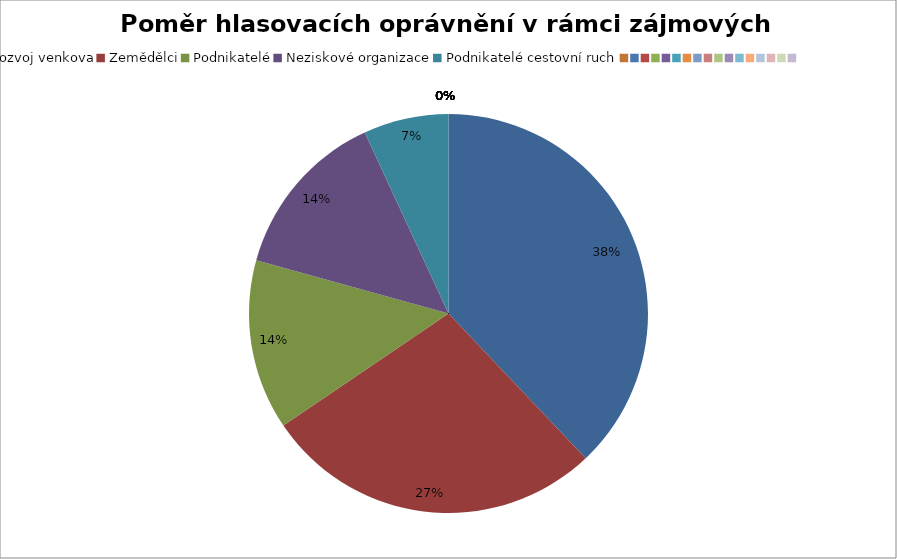
| Category | Series 0 |
|---|---|
| Rozvoj venkova | 0.379 |
| Zemědělci | 0.276 |
| Podnikatelé | 0.138 |
| Neziskové organizace | 0.138 |
| Podnikatelé cestovní ruch | 0.069 |